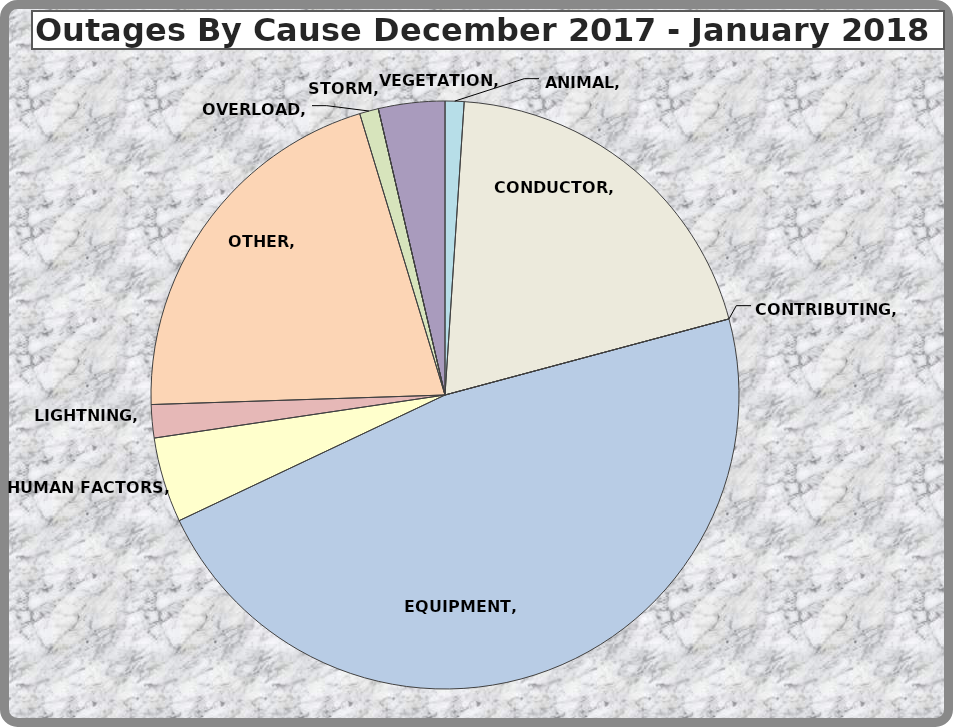
| Category | Series 0 |
|---|---|
| ANIMAL | 4 |
| CONDUCTOR | 76 |
| CONTRIBUTING | 0 |
| EQUIPMENT | 181 |
| HUMAN FACTORS | 18 |
| LIGHTNING | 7 |
| OTHER | 80 |
| OVERLOAD | 4 |
| STORM | 0 |
| VEGETATION | 14 |